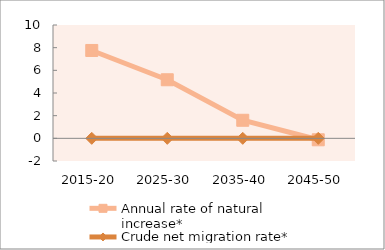
| Category | Annual rate of natural increase* | Crude net migration rate* |
|---|---|---|
| 2015-20 | 7.752 | 0 |
| 2025-30 | 5.169 | 0 |
| 2035-40 | 1.594 | 0 |
| 2045-50 | -0.128 | 0 |